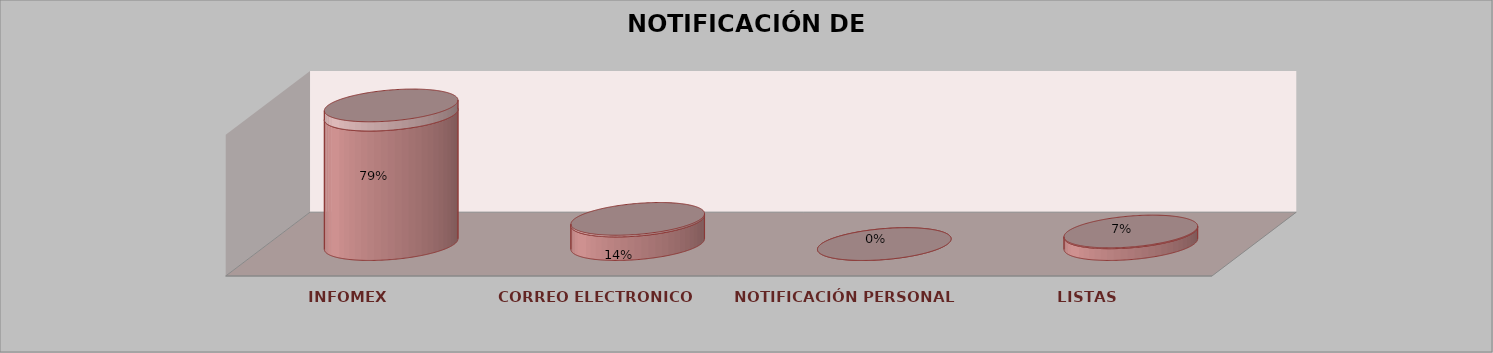
| Category | Series 0 | Series 1 | Series 2 | Series 3 | Series 4 |
|---|---|---|---|---|---|
| INFOMEX |  |  |  | 11 | 0.786 |
| CORREO ELECTRONICO |  |  |  | 2 | 0.143 |
| NOTIFICACIÓN PERSONAL |  |  |  | 0 | 0 |
| LISTAS |  |  |  | 1 | 0.071 |